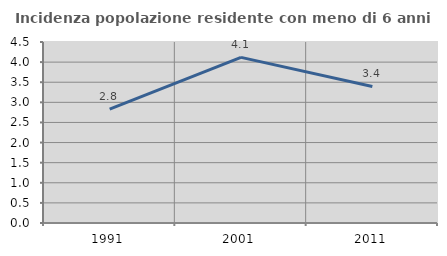
| Category | Incidenza popolazione residente con meno di 6 anni |
|---|---|
| 1991.0 | 2.833 |
| 2001.0 | 4.118 |
| 2011.0 | 3.395 |